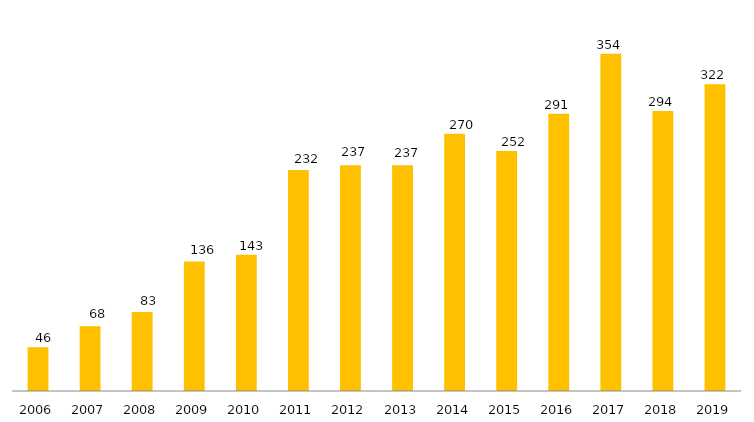
| Category | Programa |
|---|---|
| 2006.0 | 46 |
| 2007.0 | 68 |
| 2008.0 | 83 |
| 2009.0 | 136 |
| 2010.0 | 143 |
| 2011.0 | 232 |
| 2012.0 | 237 |
| 2013.0 | 237 |
| 2014.0 | 270 |
| 2015.0 | 252 |
| 2016.0 | 291 |
| 2017.0 | 354 |
| 2018.0 | 294 |
| 2019.0 | 322 |